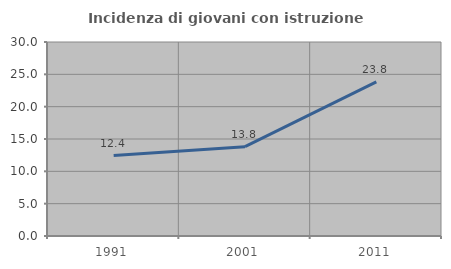
| Category | Incidenza di giovani con istruzione universitaria |
|---|---|
| 1991.0 | 12.438 |
| 2001.0 | 13.817 |
| 2011.0 | 23.839 |